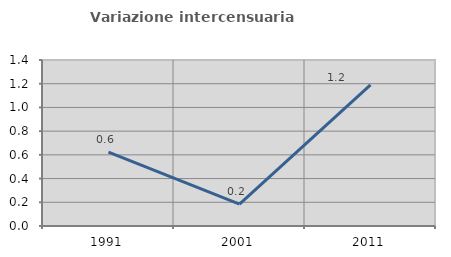
| Category | Variazione intercensuaria annua |
|---|---|
| 1991.0 | 0.623 |
| 2001.0 | 0.185 |
| 2011.0 | 1.19 |